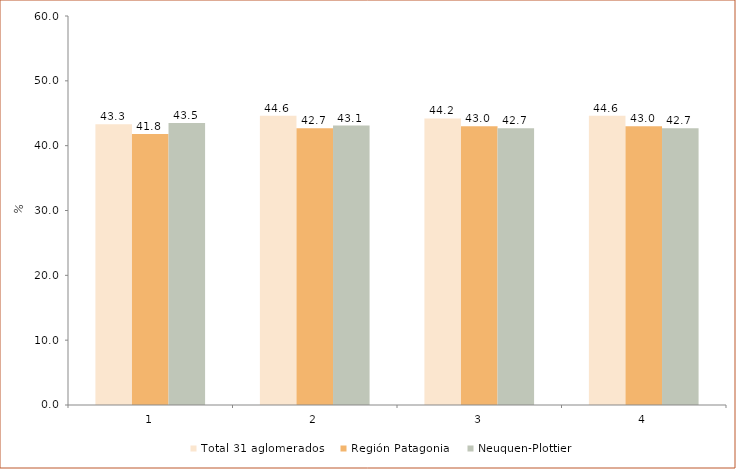
| Category | Total 31 aglomerados | Región Patagonia | Neuquen-Plottier |
|---|---|---|---|
| 0 | 43.3 | 41.8 | 43.5 |
| 1 | 44.6 | 42.7 | 43.1 |
| 2 | 44.2 | 43 | 42.7 |
| 3 | 44.6 | 43 | 42.7 |